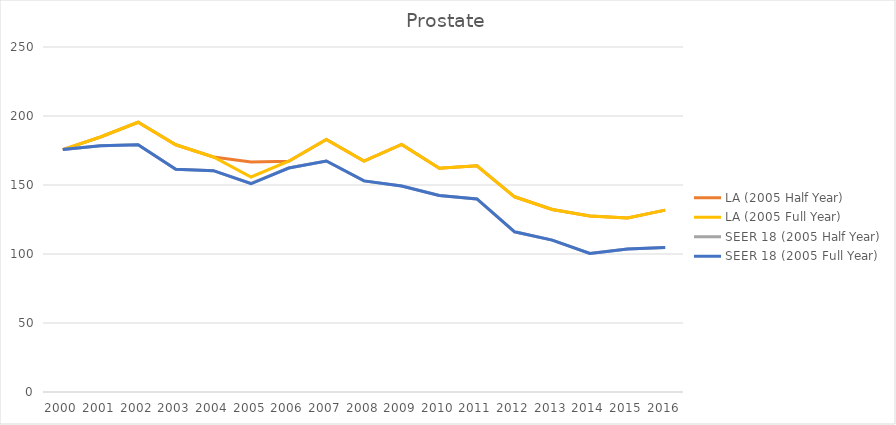
| Category | LA (2005 Half Year) | LA (2005 Full Year) | SEER 18 (2005 Half Year) | SEER 18 (2005 Full Year) |
|---|---|---|---|---|
| 2000.0 | 175.632 | 175.632 | 175.671 | 175.671 |
| 2001.0 | 184.784 | 184.784 | 178.389 | 178.389 |
| 2002.0 | 195.465 | 195.465 | 179.174 | 179.174 |
| 2003.0 | 179.153 | 179.153 | 161.481 | 161.481 |
| 2004.0 | 170.299 | 170.299 | 160.392 | 160.392 |
| 2005.0 | 166.695 | 155.812 | 151.084 | 150.899 |
| 2006.0 | 167.21 | 167.21 | 162.29 | 162.29 |
| 2007.0 | 183.006 | 183.006 | 167.376 | 167.376 |
| 2008.0 | 167.304 | 167.304 | 152.977 | 152.977 |
| 2009.0 | 179.411 | 179.411 | 149.218 | 149.218 |
| 2010.0 | 162.131 | 162.131 | 142.34 | 142.34 |
| 2011.0 | 163.951 | 163.951 | 139.92 | 139.92 |
| 2012.0 | 141.453 | 141.453 | 116.117 | 116.117 |
| 2013.0 | 132.275 | 132.275 | 110.069 | 110.069 |
| 2014.0 | 127.497 | 127.497 | 100.364 | 100.364 |
| 2015.0 | 126.062 | 126.062 | 103.682 | 103.682 |
| 2016.0 | 131.776 | 131.776 | 104.735 | 104.735 |